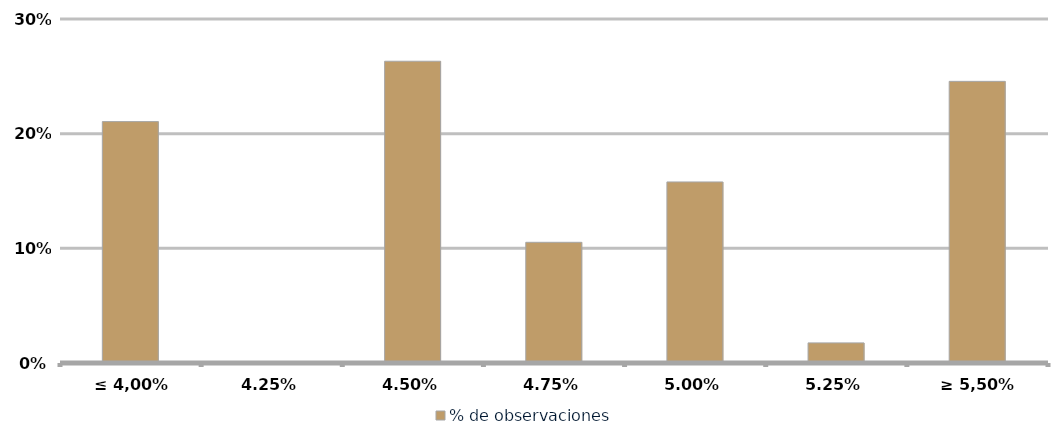
| Category | % de observaciones  |
|---|---|
| ≤ 4,00% | 0.211 |
| 4,25% | 0 |
| 4,50% | 0.263 |
| 4,75% | 0.105 |
| 5,00% | 0.158 |
| 5,25% | 0.018 |
| ≥ 5,50% | 0.246 |